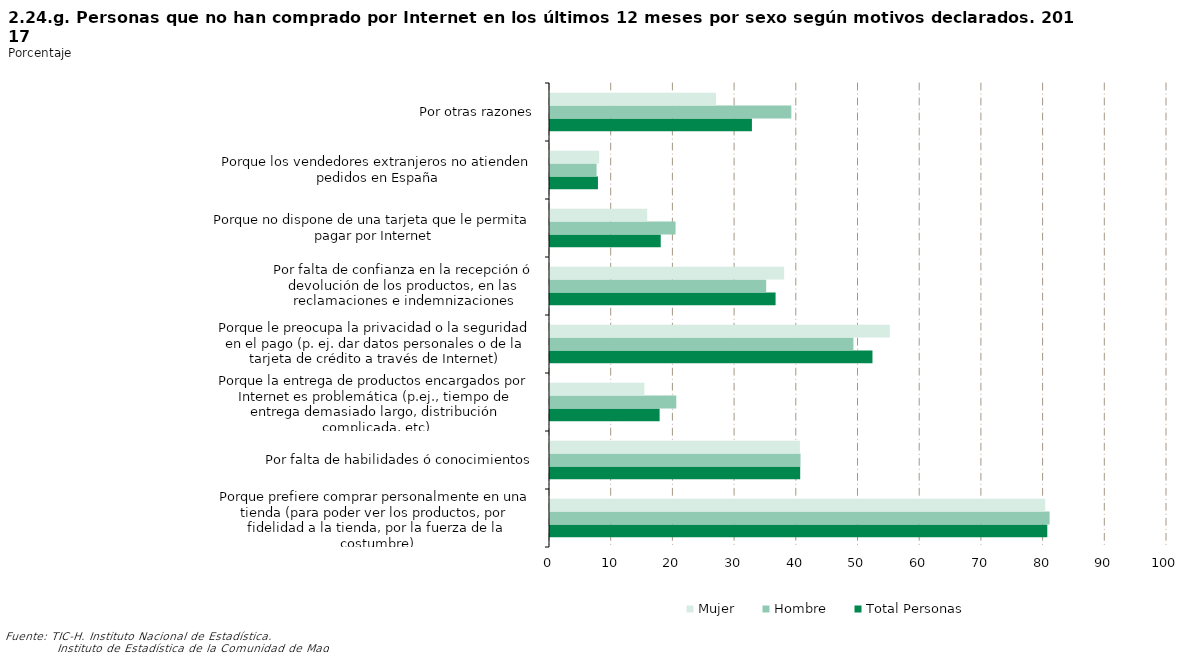
| Category | Total Personas | Hombre | Mujer |
|---|---|---|---|
| Porque prefiere comprar personalmente en una tienda (para poder ver los productos, por fidelidad a la tienda, por la fuerza de la costumbre) | 80.6 | 80.974 | 80.258 |
| Por falta de habilidades ó conocimientos | 40.55 | 40.603 | 40.502 |
| Porque la entrega de productos encargados por Internet es problemática (p.ej., tiempo de entrega demasiado largo, distribución complicada, etc) | 17.766 | 20.465 | 15.303 |
| Porque le preocupa la privacidad o la seguridad en el pago (p. ej. dar datos personales o de la tarjeta de crédito a través de Internet) | 52.264 | 49.179 | 55.078 |
| Por falta de confianza en la recepción ó devolución de los productos, en las reclamaciones e indemnizaciones | 36.56 | 35.04 | 37.946 |
| Porque no dispone de una tarjeta que le permita pagar por Internet | 17.946 | 20.352 | 15.752 |
| Porque los vendedores extranjeros no atienden pedidos en España | 7.771 | 7.553 | 7.971 |
| Por otras razones | 32.727 | 39.112 | 26.902 |